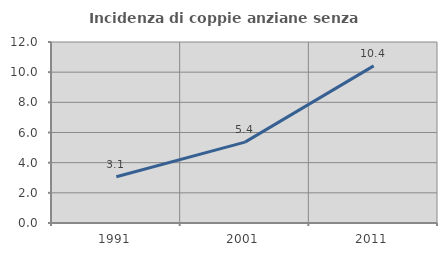
| Category | Incidenza di coppie anziane senza figli  |
|---|---|
| 1991.0 | 3.069 |
| 2001.0 | 5.361 |
| 2011.0 | 10.417 |